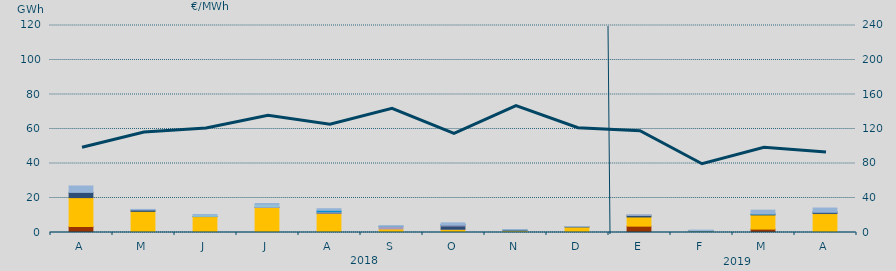
| Category | Carbón | Ciclo Combinado | Cogeneración | Consumo Bombeo | Enlace Península Baleares | Hidráulica | Internacionales | Turbinación bombeo |
|---|---|---|---|---|---|---|---|---|
| A | 3485.4 | 16735.1 | 0 | 3030.8 | 0 | 0 | 0 | 3717.6 |
| M | 0 | 12256.8 | 0 | 795.1 | 0 | 0 | 0 | 330.9 |
| J | 0 | 9234.9 | 0 | 91.5 | 0 | 0 | 976 | 107.7 |
| J | 92.3 | 14456.3 | 0 | 14.6 | 244 | 0 | 1458.3 | 560.7 |
| A | 291.3 | 10832 | 0 | 140.5 | 678 | 898.1 | 0 | 948.3 |
| S | 0 | 2035.7 | 0 | 0 | 1565.3 | 5 | 0 | 107.3 |
| O | 0 | 1903.4 | 7.4 | 1893.5 | 711 | 97 | 0 | 979 |
| N | 0 | 1082.6 | 0 | 481.8 | 0 | 0 | 2.8 | 84 |
| D | 0 | 3205.2 | 0 | 176.9 | 0 | 0 | 0 | 86.6 |
| E | 3682 | 5322.9 | 0 | 938.4 | 84 | 0 | 0 | 101.3 |
| F | 0 | 833.4 | 0 | 213.9 | 0 | 20 | 0 | 316.9 |
| M | 1971 | 8220.1 | 0 | 457 | 0 | 93.4 | 0 | 2222.8 |
| A | 0 | 10989.2 | 0 | 526.4 | 464.9 | 36.7 | 0 | 2160.3 |